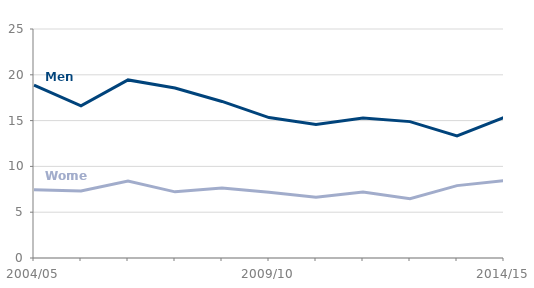
| Category | Men | Women |
|---|---|---|
| 2004/05 | 18871 | 7461 |
| 2005/06 | 16603 | 7305 |
| 2006/07 | 19440 | 8395 |
| 2007/08 | 18558 | 7222 |
| 2008/09 | 17090 | 7633 |
| 2009/10 | 15328 | 7170 |
| 2010/11 | 14583 | 6644 |
| 2011/12 | 15284 | 7214 |
| 2012/13 | 14889 | 6469 |
| 2013/14 | 13335 | 7902 |
| 2014/15 | 15350 | 8435 |